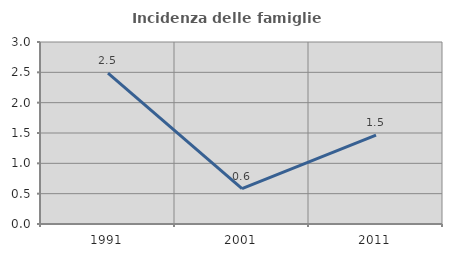
| Category | Incidenza delle famiglie numerose |
|---|---|
| 1991.0 | 2.487 |
| 2001.0 | 0.581 |
| 2011.0 | 1.464 |